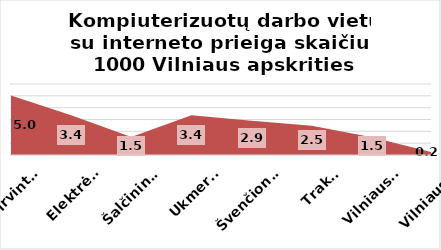
| Category | Series 0 |
|---|---|
| Širvintos | 5.03 |
| Elektrėnai | 3.36 |
| Šalčininkai | 1.524 |
| Ukmergė | 3.358 |
| Švenčionys | 2.89 |
| Trakai | 2.469 |
| Vilniaus r. | 1.49 |
| Vilniaus m. | 0.237 |